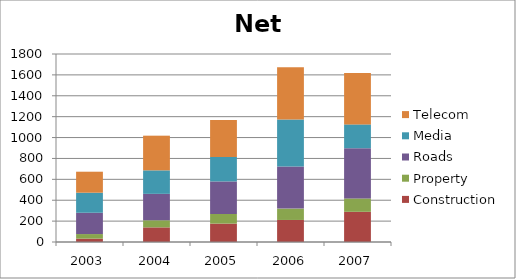
| Category | Construction | Property | Roads | Media | Telecom |
|---|---|---|---|---|---|
| 2003.0 | 32 | 44 | 204 | 192 | 201 |
| 2004.0 | 140 | 68 | 253 | 225 | 332 |
| 2005.0 | 176 | 92 | 312 | 235 | 352 |
| 2006.0 | 211 | 109 | 402 | 452 | 499 |
| 2007.0 | 289 | 128 | 481 | 228 | 492 |